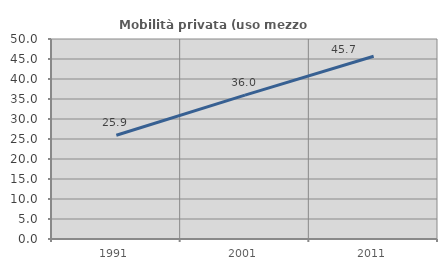
| Category | Mobilità privata (uso mezzo privato) |
|---|---|
| 1991.0 | 25.948 |
| 2001.0 | 35.957 |
| 2011.0 | 45.695 |